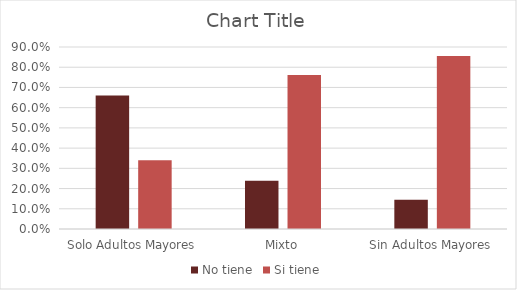
| Category | No tiene | Si tiene |
|---|---|---|
| Solo Adultos Mayores | 0.66 | 0.34 |
| Mixto | 0.238 | 0.762 |
| Sin Adultos Mayores | 0.145 | 0.855 |